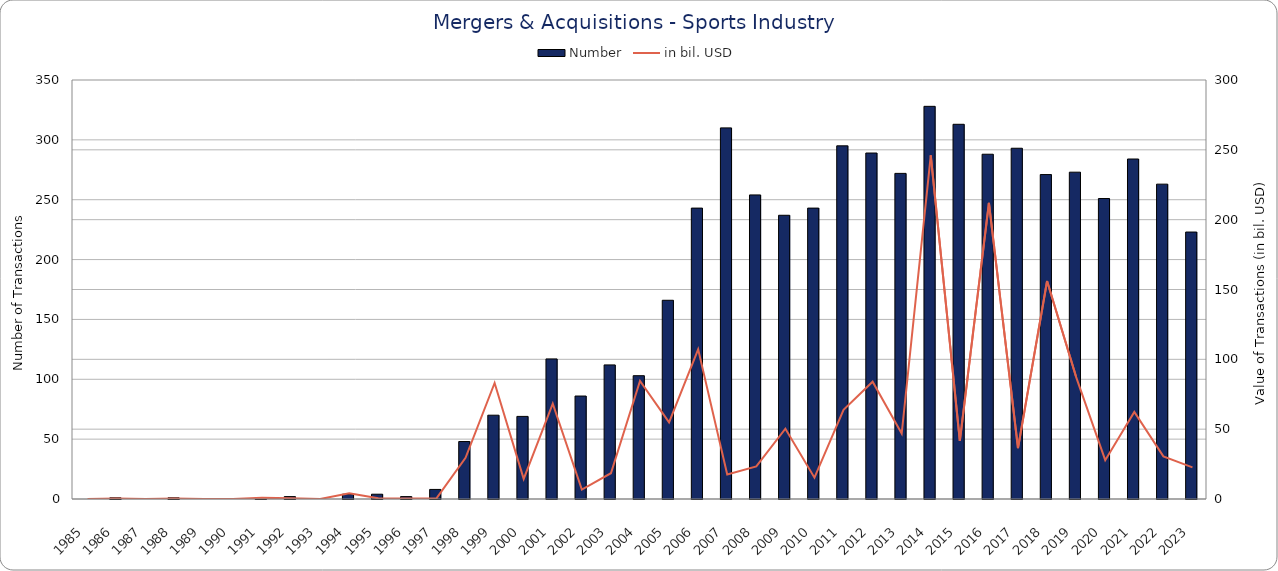
| Category | Number |
|---|---|
| 1985 | 0 |
| 1986 | 1 |
| 1987 | 0 |
| 1988 | 1 |
| 1989 | 0 |
| 1990 | 0 |
| 1991 | 1 |
| 1992 | 2 |
| 1993 | 0 |
| 1994 | 4 |
| 1995 | 4 |
| 1996 | 2 |
| 1997 | 8 |
| 1998 | 48 |
| 1999 | 70 |
| 2000 | 69 |
| 2001 | 117 |
| 2002 | 86 |
| 2003 | 112 |
| 2004 | 103 |
| 2005 | 166 |
| 2006 | 243 |
| 2007 | 310 |
| 2008 | 254 |
| 2009 | 237 |
| 2010 | 243 |
| 2011 | 295 |
| 2012 | 289 |
| 2013 | 272 |
| 2014 | 328 |
| 2015 | 313 |
| 2016 | 288 |
| 2017 | 293 |
| 2018 | 271 |
| 2019 | 273 |
| 2020 | 251 |
| 2021 | 284 |
| 2022 | 263 |
| 2023 | 223 |